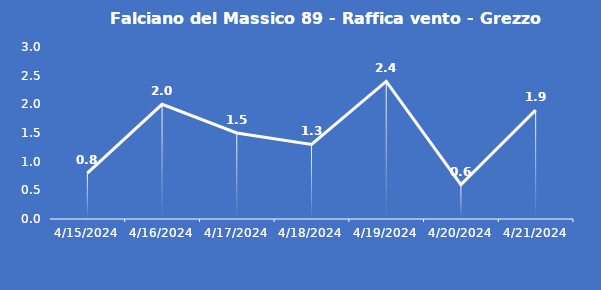
| Category | Falciano del Massico 89 - Raffica vento - Grezzo (m/s) |
|---|---|
| 4/15/24 | 0.8 |
| 4/16/24 | 2 |
| 4/17/24 | 1.5 |
| 4/18/24 | 1.3 |
| 4/19/24 | 2.4 |
| 4/20/24 | 0.6 |
| 4/21/24 | 1.9 |